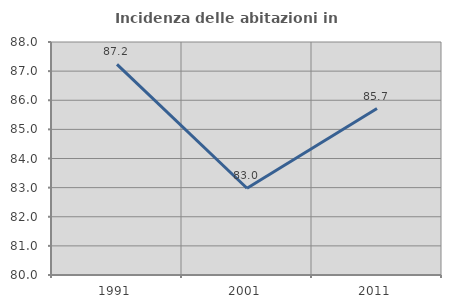
| Category | Incidenza delle abitazioni in proprietà  |
|---|---|
| 1991.0 | 87.234 |
| 2001.0 | 82.979 |
| 2011.0 | 85.714 |